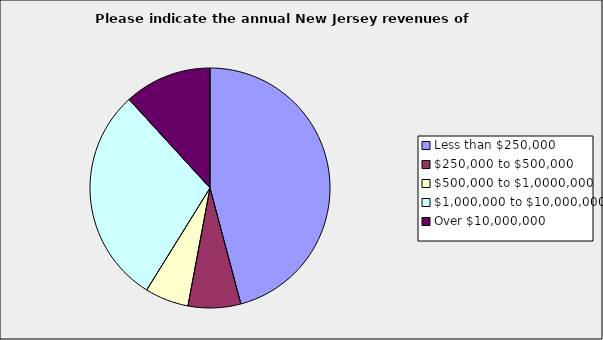
| Category | Series 0 |
|---|---|
| Less than $250,000 | 0.459 |
| $250,000 to $500,000 | 0.071 |
| $500,000 to $1,0000,000 | 0.059 |
| $1,000,000 to $10,000,000 | 0.294 |
| Over $10,000,000 | 0.118 |